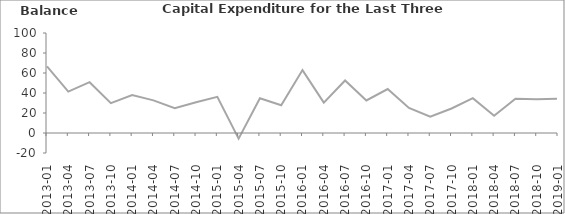
| Category | Balance |
|---|---|
| 2013-01 | 66.6 |
| 2013-04 | 41.4 |
| 2013-07 | 50.8 |
| 2013-10 | 29.9 |
| 2014-01 | 38 |
| 2014-04 | 32.6 |
| 2014-07 | 24.8 |
| 2014-10 | 30.8 |
| 2015-01 | 36.1 |
| 2015-04 | -5.7 |
| 2015-07 | 34.7 |
| 2015-10 | 27.7 |
| 2016-01 | 62.9 |
| 2016-04 | 30.4 |
| 2016-07 | 52.5 |
| 2016-10 | 32.5 |
| 2017-01 | 44 |
| 2017-04 | 25 |
| 2017-07 | 16.3 |
| 2017-10 | 24.5 |
| 2018-01 | 34.8 |
| 2018-04 | 17.2 |
| 2018-07 | 34.3 |
| 2018-10 | 33.8 |
| 2019-01 | 34.4 |